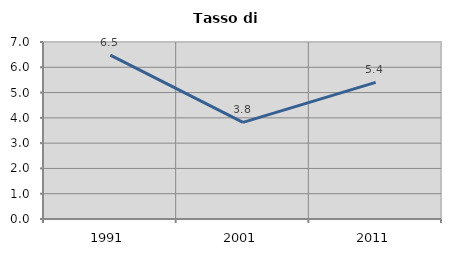
| Category | Tasso di disoccupazione   |
|---|---|
| 1991.0 | 6.482 |
| 2001.0 | 3.823 |
| 2011.0 | 5.403 |